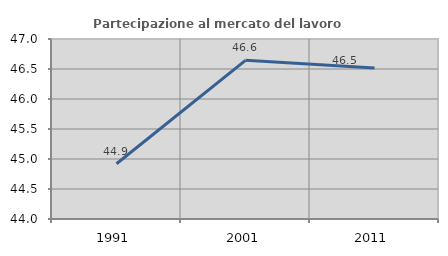
| Category | Partecipazione al mercato del lavoro  femminile |
|---|---|
| 1991.0 | 44.921 |
| 2001.0 | 46.644 |
| 2011.0 | 46.517 |